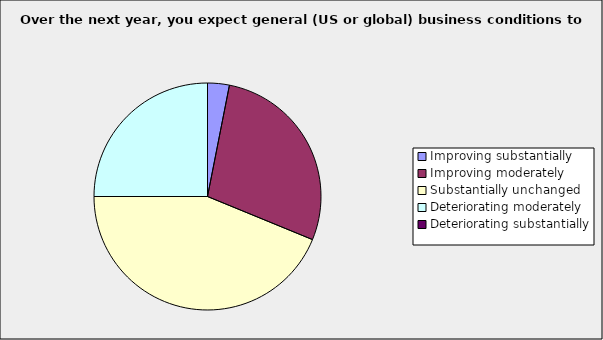
| Category | Series 0 |
|---|---|
| Improving substantially | 0.031 |
| Improving moderately | 0.281 |
| Substantially unchanged | 0.438 |
| Deteriorating moderately | 0.25 |
| Deteriorating substantially | 0 |